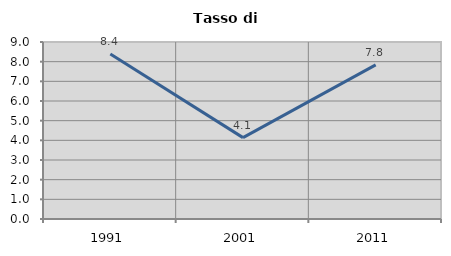
| Category | Tasso di disoccupazione   |
|---|---|
| 1991.0 | 8.392 |
| 2001.0 | 4.137 |
| 2011.0 | 7.836 |